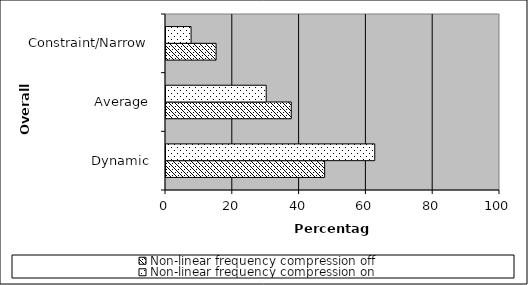
| Category | Non-linear frequency compression off | Non-linear frequency compression on |
|---|---|---|
| Dynamic | 47.5 | 62.5 |
| Average | 37.5 | 30 |
| Constraint/Narrow | 15 | 7.5 |